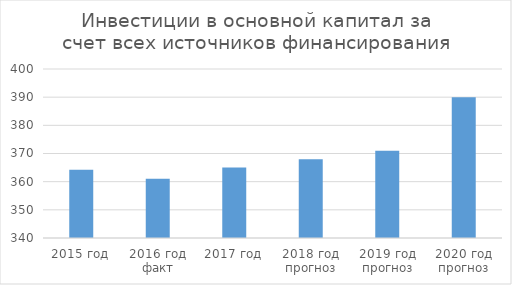
| Category | Инвестиции в основной капитал за счет всех источников финансирования |
|---|---|
| 2015 год | 364.2 |
| 2016 год факт | 361 |
| 2017 год | 365 |
| 2018 год прогноз | 368 |
| 2019 год прогноз | 371 |
| 2020 год прогноз | 390 |